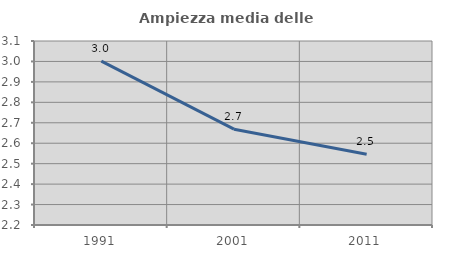
| Category | Ampiezza media delle famiglie |
|---|---|
| 1991.0 | 3.001 |
| 2001.0 | 2.669 |
| 2011.0 | 2.546 |